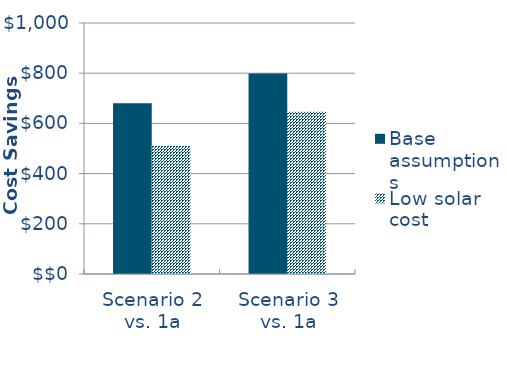
| Category | Base assumptions  | Low solar cost |
|---|---|---|
| Scenario 2 vs. 1a | -679.806 | -510.337 |
| Scenario 3 vs. 1a | -799.049 | -646.71 |